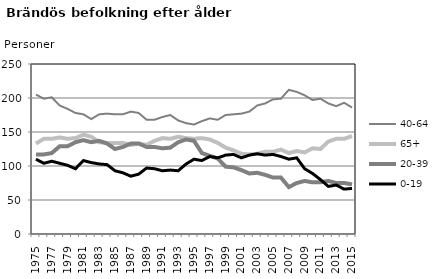
| Category | 40-64 | 65+ | 20-39 | 0-19 |
|---|---|---|---|---|
| 1975.0 | 205 | 133 | 117 | 110 |
| 1976.0 | 199 | 140 | 117 | 104 |
| 1977.0 | 201 | 140 | 119 | 107 |
| 1978.0 | 189 | 142 | 129 | 104 |
| 1979.0 | 184 | 140 | 129 | 101 |
| 1980.0 | 178 | 141 | 135 | 96 |
| 1981.0 | 176 | 146 | 138 | 108 |
| 1982.0 | 169 | 143 | 135 | 105 |
| 1983.0 | 176 | 135 | 137 | 103 |
| 1984.0 | 177 | 134 | 133 | 102 |
| 1985.0 | 176 | 134 | 125 | 93 |
| 1986.0 | 176 | 134 | 128 | 90 |
| 1987.0 | 180 | 131 | 133 | 85 |
| 1988.0 | 178 | 133 | 133 | 88 |
| 1989.0 | 168 | 131 | 128 | 97 |
| 1990.0 | 168 | 137 | 128 | 96 |
| 1991.0 | 172 | 141 | 126 | 93 |
| 1992.0 | 175 | 140 | 127 | 94 |
| 1993.0 | 167 | 143 | 135 | 93 |
| 1994.0 | 163 | 141 | 139 | 103 |
| 1995.0 | 161 | 140 | 137 | 110 |
| 1996.0 | 166 | 141 | 119 | 108 |
| 1997.0 | 170 | 139 | 115 | 114 |
| 1998.0 | 168 | 134 | 111 | 112 |
| 1999.0 | 175 | 127 | 99 | 116 |
| 2000.0 | 176 | 123 | 98 | 117 |
| 2001.0 | 177 | 118 | 94 | 112 |
| 2002.0 | 180 | 117 | 89 | 116 |
| 2003.0 | 189 | 118 | 90 | 118 |
| 2004.0 | 192 | 121 | 87 | 116 |
| 2005.0 | 198 | 121 | 83 | 117 |
| 2006.0 | 199 | 124 | 83 | 114 |
| 2007.0 | 212 | 119 | 69 | 110 |
| 2008.0 | 209 | 122 | 75 | 112 |
| 2009.0 | 204 | 120 | 78 | 96 |
| 2010.0 | 197 | 126 | 76 | 89 |
| 2011.0 | 199 | 125 | 76 | 80 |
| 2012.0 | 192 | 136 | 78 | 70 |
| 2013.0 | 188 | 140 | 75 | 72 |
| 2014.0 | 193 | 140 | 75 | 66 |
| 2015.0 | 186 | 144 | 73 | 67 |